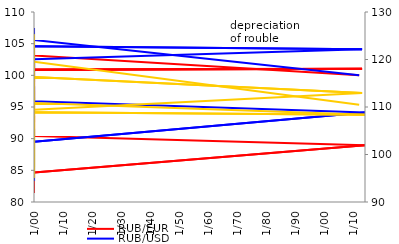
| Category | RUB/EUR | RUB/USD |
|---|---|---|
| 2012-01-01 | 100 | 100 |
| 1900-01-02 | 103.137 | 105.566 |
| 1900-01-03 | 104.997 | 107.483 |
| 1900-01-04 | 104.848 | 106.975 |
| 1900-01-05 | 103.4 | 102.992 |
| 1900-01-06 | 98.956 | 96.101 |
| 1900-01-07 | 101.6 | 96.941 |
| 1900-01-08 | 102.898 | 98.705 |
| 1900-01-09 | 100.567 | 99.985 |
| 1900-01-10 | 100.978 | 101.402 |
| 1900-01-11 | 101.014 | 100.464 |
| 1900-01-12 | 100.978 | 102.546 |
| 2013-01-01 | 101.054 | 104.104 |
| 1900-01-02 | 100.848 | 104.575 |
| 1900-01-03 | 101.934 | 102.485 |
| 1900-01-04 | 99.956 | 100.654 |
| 1900-01-05 | 100.384 | 100.931 |
| 1900-01-06 | 95.601 | 97.694 |
| 1900-01-07 | 95.114 | 96.346 |
| 1900-01-08 | 92.608 | 95.542 |
| 1900-01-09 | 93.585 | 96.662 |
| 1900-01-10 | 93.073 | 98.267 |
| 1900-01-11 | 92.344 | 96.636 |
| 1900-01-12 | 90.411 | 95.891 |
| 2014-01-01 | 88.952 | 94.133 |
| 1900-01-02 | 84.64 | 89.499 |
| 1900-01-03 | 81.418 | 87.147 |
| 1900-01-04 | 82.69 | 88.436 |
| 1900-01-05 | 84.69 | 90.257 |
| 1900-01-06 | 86.896 | 91.553 |
| 1900-01-07 | 86.712 | 91.072 |
| 1900-01-08 | 84.698 | 87.477 |
| 1900-01-09 | 83.161 | 83.32 |